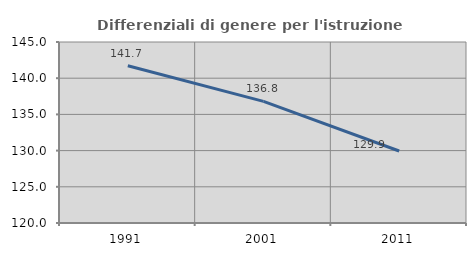
| Category | Differenziali di genere per l'istruzione superiore |
|---|---|
| 1991.0 | 141.727 |
| 2001.0 | 136.801 |
| 2011.0 | 129.943 |